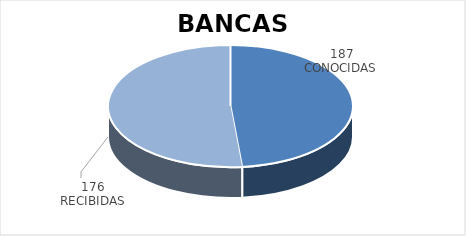
| Category | Series 0 |
|---|---|
| 0 | 176 |
| 1 | 187 |